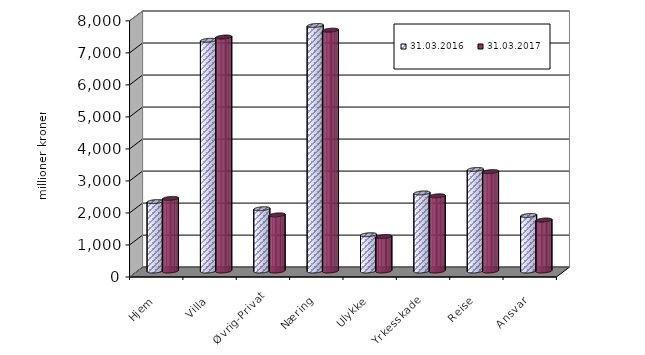
| Category | 31.03.2016 | 31.03.2017 |
|---|---|---|
| Hjem | 2168.852 | 2267.917 |
| Villa | 7205.664 | 7308.315 |
| Øvrig-Privat | 1945.582 | 1753.278 |
| Næring | 7668.993 | 7522.276 |
| Ulykke | 1133.989 | 1075.598 |
| Yrkesskade | 2438.5 | 2348.209 |
| Reise | 3171.493 | 3104.798 |
| Ansvar | 1734.875 | 1592.354 |